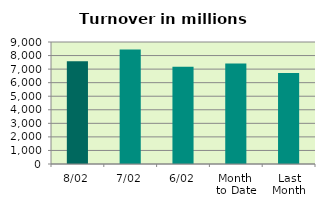
| Category | Series 0 |
|---|---|
| 8/02 | 7572.034 |
| 7/02 | 8447.134 |
| 6/02 | 7179.957 |
| Month 
to Date | 7405.666 |
| Last
Month | 6707.699 |